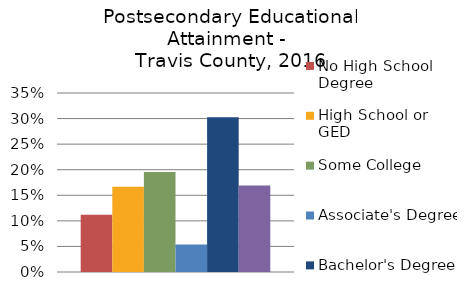
| Category | No High School Degree | High School or GED | Some College | Associate's Degree | Bachelor's Degree | Graduate or Professional Degree |
|---|---|---|---|---|---|---|
| Bachelor's Degree | 0.112 | 0.167 | 0.196 | 0.054 | 0.303 | 0.169 |